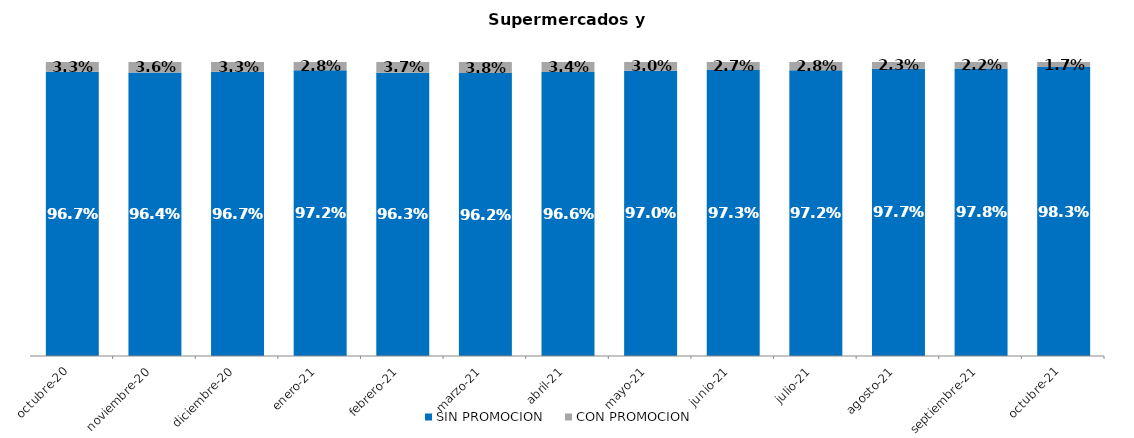
| Category | SIN PROMOCION   | CON PROMOCION   |
|---|---|---|
| 2020-10-01 | 0.967 | 0.033 |
| 2020-11-01 | 0.964 | 0.036 |
| 2020-12-01 | 0.967 | 0.033 |
| 2021-01-01 | 0.972 | 0.028 |
| 2021-02-01 | 0.963 | 0.037 |
| 2021-03-01 | 0.962 | 0.038 |
| 2021-04-01 | 0.966 | 0.034 |
| 2021-05-01 | 0.97 | 0.03 |
| 2021-06-01 | 0.973 | 0.027 |
| 2021-07-01 | 0.972 | 0.028 |
| 2021-08-01 | 0.977 | 0.023 |
| 2021-09-01 | 0.978 | 0.022 |
| 2021-10-01 | 0.983 | 0.017 |